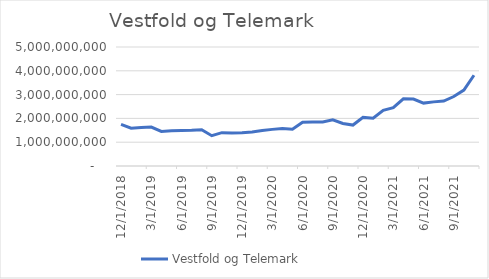
| Category | Vestfold og Telemark |
|---|---|
| 12/1/18 | 1749696666.667 |
| 1/1/19 | 1588188333.333 |
| 2/1/19 | 1613546666.667 |
| 3/1/19 | 1635563333.333 |
| 4/1/19 | 1454006250 |
| 5/1/19 | 1484225000 |
| 6/1/19 | 1493691666.667 |
| 7/1/19 | 1498288333.333 |
| 8/1/19 | 1523788333.333 |
| 9/1/19 | 1271725833.333 |
| 10/1/19 | 1399709166.667 |
| 11/1/19 | 1384942500 |
| 12/1/19 | 1398430000 |
| 1/1/20 | 1431324166.667 |
| 2/1/20 | 1490295000 |
| 3/1/20 | 1539003333.333 |
| 4/1/20 | 1572502500 |
| 5/1/20 | 1540452500 |
| 6/1/20 | 1841381666.667 |
| 7/1/20 | 1847990000 |
| 8/1/20 | 1847865000 |
| 9/1/20 | 1941239583.333 |
| 10/1/20 | 1788272916.667 |
| 11/1/20 | 1720718750 |
| 12/1/20 | 2041327083.333 |
| 1/1/21 | 2005570416.667 |
| 2/1/21 | 2342124583.333 |
| 3/1/21 | 2450685416.667 |
| 4/1/21 | 2822531250 |
| 5/1/21 | 2811127083.333 |
| 6/1/21 | 2643100000 |
| 7/1/21 | 2694350000 |
| 8/1/21 | 2727784166.667 |
| 9/1/21 | 2918355416.667 |
| 10/1/21 | 3190682500 |
| 11/1/21 | 3812024166.667 |